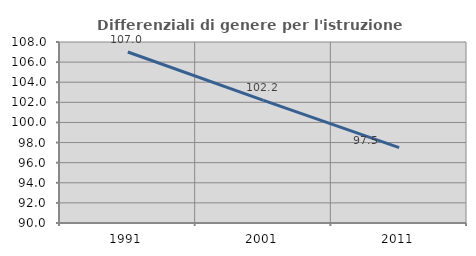
| Category | Differenziali di genere per l'istruzione superiore |
|---|---|
| 1991.0 | 107.008 |
| 2001.0 | 102.2 |
| 2011.0 | 97.494 |